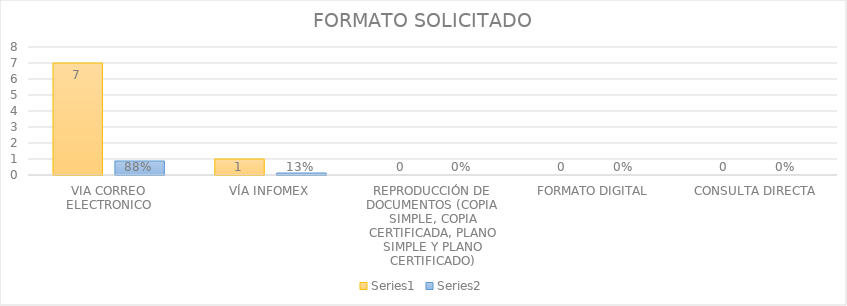
| Category | Series 3 | Series 4 |
|---|---|---|
| VIA CORREO ELECTRONICO | 7 | 0.875 |
| VÍA INFOMEX | 1 | 0.125 |
| REPRODUCCIÓN DE DOCUMENTOS (COPIA SIMPLE, COPIA CERTIFICADA, PLANO SIMPLE Y PLANO CERTIFICADO) | 0 | 0 |
| FORMATO DIGITAL | 0 | 0 |
| CONSULTA DIRECTA | 0 | 0 |